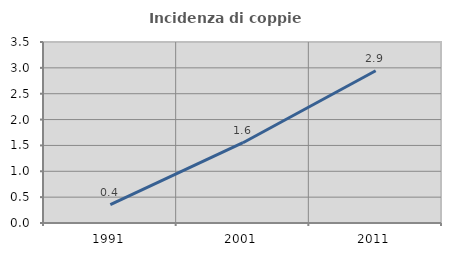
| Category | Incidenza di coppie miste |
|---|---|
| 1991.0 | 0.356 |
| 2001.0 | 1.552 |
| 2011.0 | 2.944 |